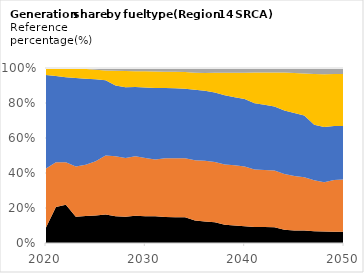
| Category | Coal | NG | Nuclear | Solar | Wind |
|---|---|---|---|---|---|
| 2020.0 | 15.958 | 60.619 | 95.823 | 7.272 | 0 |
| 2021.0 | 39.418 | 48.71 | 94.164 | 8.834 | 0 |
| 2022.0 | 42.978 | 47.909 | 95.957 | 10.408 | 0 |
| 2023.0 | 29.136 | 55.641 | 97.736 | 10.884 | 0.278 |
| 2024.0 | 30.683 | 58.346 | 98.136 | 11.078 | 1.086 |
| 2025.0 | 32.964 | 65.025 | 98.136 | 11.192 | 2.195 |
| 2026.0 | 34.218 | 70.52 | 90.346 | 11.505 | 3.046 |
| 2027.0 | 31.794 | 71.319 | 84.262 | 17.57 | 3.349 |
| 2028.0 | 31.338 | 69.679 | 84.262 | 19.207 | 3.591 |
| 2029.0 | 33.388 | 72.793 | 84.616 | 19.377 | 3.842 |
| 2030.0 | 32.106 | 70.204 | 84.97 | 19.507 | 4.05 |
| 2031.0 | 31.937 | 67.669 | 85.324 | 19.697 | 4.235 |
| 2032.0 | 31.666 | 71.467 | 85.324 | 19.913 | 4.442 |
| 2033.0 | 31.562 | 71.965 | 85.324 | 20.162 | 4.694 |
| 2034.0 | 31.556 | 72.264 | 85.324 | 20.366 | 4.975 |
| 2035.0 | 27.437 | 73.075 | 85.324 | 20.835 | 5.665 |
| 2036.0 | 26.23 | 73.732 | 85.324 | 21.587 | 5.933 |
| 2037.0 | 25.486 | 73.99 | 85.324 | 24.029 | 5.961 |
| 2038.0 | 22.495 | 74.203 | 85.324 | 27.754 | 5.962 |
| 2039.0 | 21.924 | 75.458 | 85.324 | 30.709 | 5.962 |
| 2040.0 | 21.286 | 75.428 | 85.324 | 33.321 | 5.961 |
| 2041.0 | 20.619 | 74.309 | 85.324 | 39.485 | 5.962 |
| 2042.0 | 20.896 | 74.778 | 85.324 | 42.335 | 5.962 |
| 2043.0 | 21.021 | 75.534 | 85.324 | 45.349 | 5.961 |
| 2044.0 | 17.752 | 74.849 | 85.324 | 51.275 | 5.961 |
| 2045.0 | 17.095 | 73.945 | 85.324 | 54.301 | 6.7 |
| 2046.0 | 17.281 | 73.804 | 85.75 | 58.421 | 7.585 |
| 2047.0 | 16.409 | 72.125 | 78.442 | 71.598 | 8.413 |
| 2048.0 | 16.399 | 69.677 | 78.442 | 74.8 | 8.749 |
| 2049.0 | 16.419 | 74.788 | 78.442 | 75.597 | 8.607 |
| 2050.0 | 16.378 | 77.049 | 78.442 | 76.343 | 8.96 |